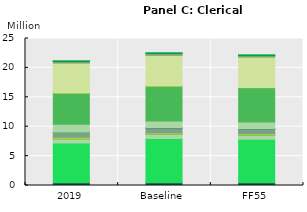
| Category | Agriculture and food | Business services | Construction | Dwellings | Electric equipment | Fossil fuels | Hydro power | Land transport | Minerals n.e.s. | Nuclear power | Other Manufacturing | Other services | Power transm. & distr. | Public services | Solar power | Transport equipement | Water collection and distr. | Wind power |
|---|---|---|---|---|---|---|---|---|---|---|---|---|---|---|---|---|---|---|
| 2019 | 0.493 | 6.738 | 0.662 | 0.026 | 0.227 | 0.048 | 0.004 | 0.857 | 0.036 | 0.008 | 1.304 | 5.268 | 0.089 | 5.081 | 0.003 | 0.301 | 0.123 | 0.005 |
| Baseline | 0.514 | 7.483 | 0.681 | 0.031 | 0.2 | 0.027 | 0.004 | 0.898 | 0.036 | 0.007 | 1.103 | 5.903 | 0.091 | 5.176 | 0.01 | 0.277 | 0.125 | 0.011 |
| FF55 | 0.507 | 7.365 | 0.677 | 0.031 | 0.21 | 0.011 | 0.004 | 0.857 | 0.034 | 0.007 | 1.109 | 5.794 | 0.081 | 5.147 | 0.013 | 0.278 | 0.124 | 0.016 |